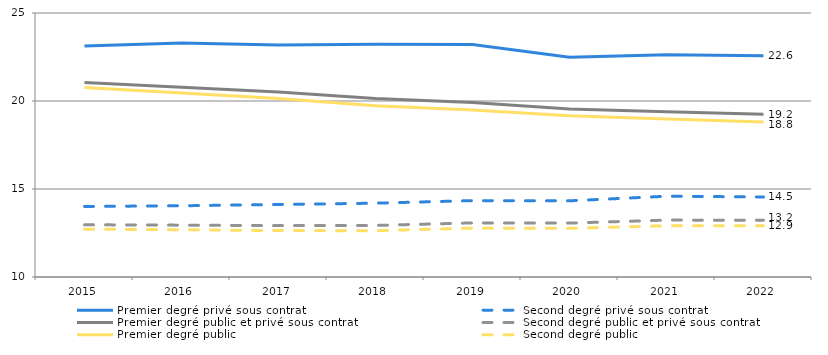
| Category | Premier degré privé sous contrat | Second degré privé sous contrat | Premier degré public et privé sous contrat | Second degré public et privé sous contrat | Premier degré public | Second degré public |
|---|---|---|---|---|---|---|
| 2015.0 | 23.129 | 14.008 | 21.053 | 12.967 | 20.77 | 12.72 |
| 2016.0 | 23.296 | 14.047 | 20.788 | 12.946 | 20.451 | 12.685 |
| 2017.0 | 23.188 | 14.119 | 20.504 | 12.919 | 20.145 | 12.637 |
| 2018.0 | 23.218 | 14.194 | 20.136 | 12.929 | 19.731 | 12.633 |
| 2019.0 | 23.209 | 14.34 | 19.915 | 13.074 | 19.488 | 12.776 |
| 2020.0 | 22.48 | 14.327 | 19.541 | 13.063 | 19.156 | 12.765 |
| 2021.0 | 22.628 | 14.589 | 19.395 | 13.232 | 18.976 | 12.912 |
| 2022.0 | 22.575 | 14.549 | 19.24 | 13.227 | 18.811 | 12.915 |